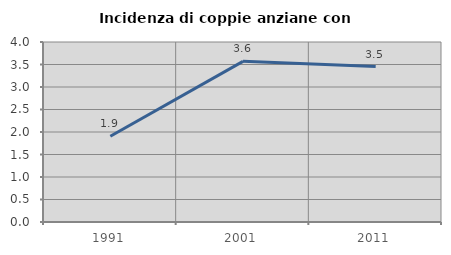
| Category | Incidenza di coppie anziane con figli |
|---|---|
| 1991.0 | 1.906 |
| 2001.0 | 3.57 |
| 2011.0 | 3.454 |